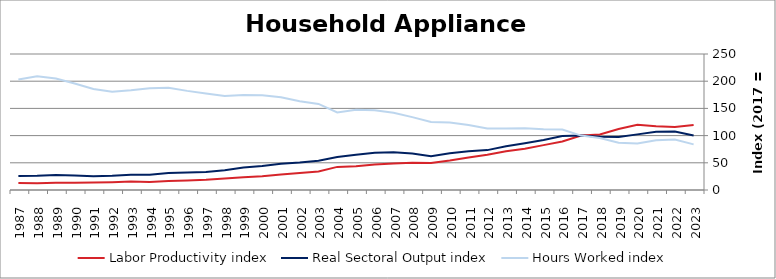
| Category | Labor Productivity index | Real Sectoral Output index | Hours Worked index |
|---|---|---|---|
| 2023.0 | 119.475 | 100.175 | 83.846 |
| 2022.0 | 115.814 | 107.507 | 92.827 |
| 2021.0 | 117.37 | 107.24 | 91.369 |
| 2020.0 | 119.806 | 102.261 | 85.355 |
| 2019.0 | 112.089 | 97.492 | 86.977 |
| 2018.0 | 102.223 | 97.855 | 95.727 |
| 2017.0 | 100 | 100 | 100 |
| 2016.0 | 89.311 | 99.296 | 111.18 |
| 2015.0 | 82.465 | 91.947 | 111.499 |
| 2014.0 | 75.838 | 85.978 | 113.372 |
| 2013.0 | 71.142 | 80.265 | 112.823 |
| 2012.0 | 64.894 | 73.334 | 113.007 |
| 2011.0 | 59.726 | 71.35 | 119.463 |
| 2010.0 | 54.373 | 67.374 | 123.91 |
| 2009.0 | 49.86 | 62.285 | 124.918 |
| 2008.0 | 50.124 | 67.123 | 133.915 |
| 2007.0 | 48.836 | 69.396 | 142.1 |
| 2006.0 | 46.814 | 68.635 | 146.611 |
| 2005.0 | 43.84 | 64.749 | 147.695 |
| 2004.0 | 42.458 | 60.52 | 142.539 |
| 2003.0 | 33.973 | 53.774 | 158.285 |
| 2002.0 | 31.046 | 50.602 | 162.99 |
| 2001.0 | 28.29 | 48.256 | 170.579 |
| 2000.0 | 25.381 | 44.232 | 174.27 |
| 1999.0 | 23.6 | 41.168 | 174.443 |
| 1998.0 | 21.087 | 36.418 | 172.698 |
| 1997.0 | 18.659 | 33.088 | 177.335 |
| 1996.0 | 17.605 | 32.082 | 182.231 |
| 1995.0 | 16.512 | 31.051 | 188.053 |
| 1994.0 | 14.891 | 27.844 | 186.99 |
| 1993.0 | 15.414 | 28.232 | 183.166 |
| 1992.0 | 14.367 | 25.97 | 180.762 |
| 1991.0 | 13.627 | 25.297 | 185.639 |
| 1990.0 | 13.497 | 26.432 | 195.833 |
| 1989.0 | 13.522 | 27.711 | 204.939 |
| 1988.0 | 12.417 | 25.985 | 209.274 |
| 1987.0 | 12.661 | 25.702 | 202.995 |